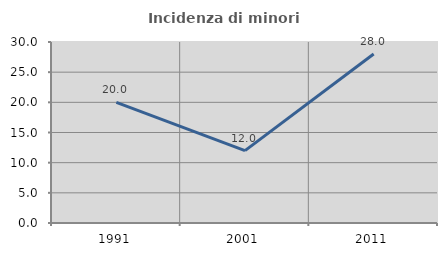
| Category | Incidenza di minori stranieri |
|---|---|
| 1991.0 | 20 |
| 2001.0 | 12 |
| 2011.0 | 28 |